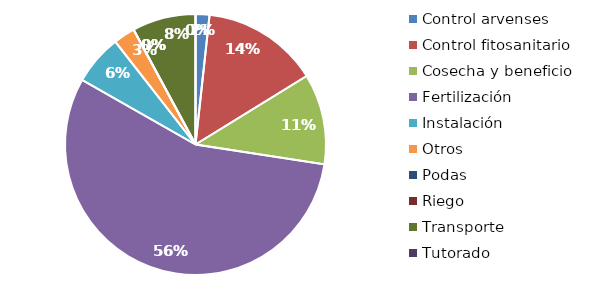
| Category | Valor |
|---|---|
| Control arvenses | 2384720 |
| Control fitosanitario | 20046054 |
| Cosecha y beneficio | 15534578.344 |
| Fertilización | 77221042 |
| Instalación | 8621713.885 |
| Otros | 3698724 |
| Podas | 0 |
| Riego | 0 |
| Transporte | 10889450 |
| Tutorado | 0 |